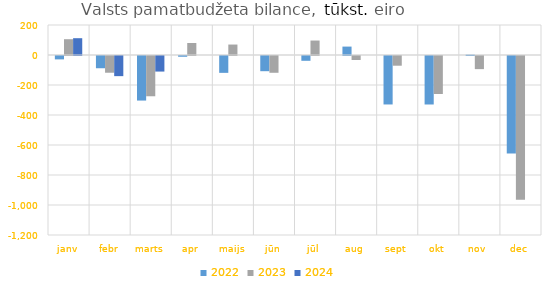
| Category | 2022 | 2023 | 2024 |
|---|---|---|---|
| janv | -22576.613 | 105353.718 | 111979.605 |
| febr | -81631.044 | -111573.897 | -134250.835 |
| marts | -297136.226 | -268446.374 | -103808.377 |
| apr | -5088.903 | 80162.835 | 0 |
| maijs | -112366.131 | 69722.715 | 0 |
| jūn | -101334.812 | -111818.831 | 0 |
| jūl | -31986.255 | 96437.577 | 0 |
| aug | 56068.97 | -26561.409 | 0 |
| sept | -323095.809 | -64729.897 | 0 |
| okt | -323290.39 | -253457.177 | 0 |
| nov | 2508.419 | -87529.517 | 0 |
| dec | -649319.296 | -958560.445 | 0 |